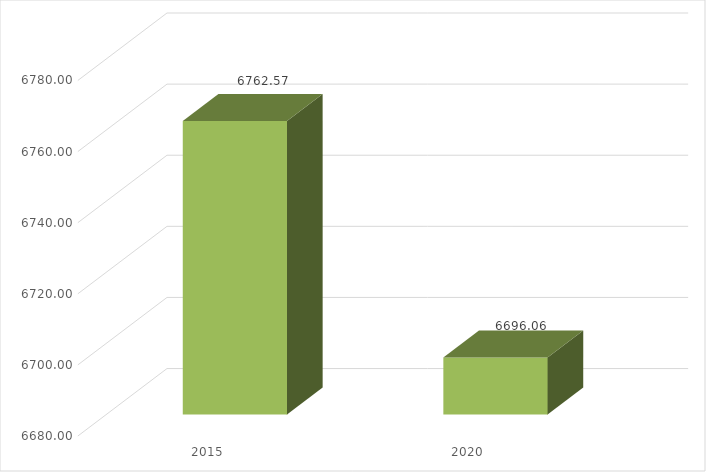
| Category | Series 0 |
|---|---|
| 2015.0 | 6762.571 |
| 2020.0 | 6696.061 |